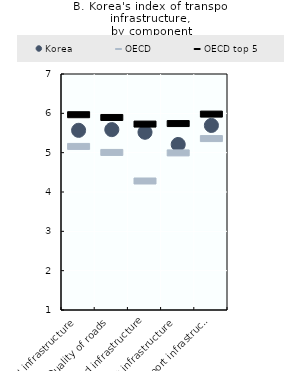
| Category | Korea | OECD | OECD top 5 |
|---|---|---|---|
| Quality of overall infrastructure | 5.568 | 5.159 | 5.965 |
| Quality of roads | 5.586 | 5.005 | 5.895 |
| Quality of railroad infrastructure | 5.519 | 4.279 | 5.727 |
| Quality of port infrastructure | 5.208 | 4.994 | 5.74 |
| Quality of air transport infrastructure | 5.692 | 5.358 | 5.981 |